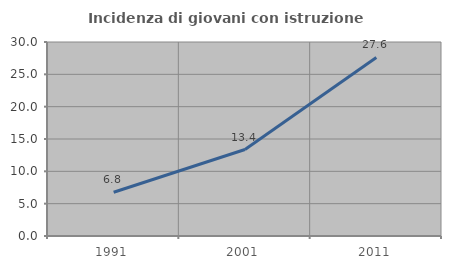
| Category | Incidenza di giovani con istruzione universitaria |
|---|---|
| 1991.0 | 6.771 |
| 2001.0 | 13.372 |
| 2011.0 | 27.607 |